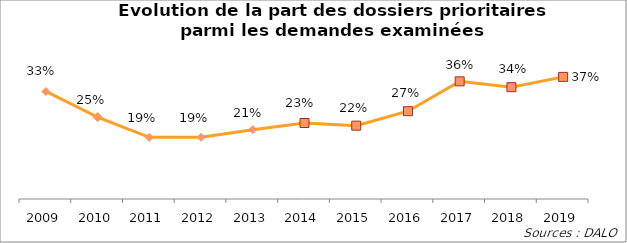
| Category | Series 1 |
|---|---|
| 2009.0 | 0.326 |
| 2010.0 | 0.248 |
| 2011.0 | 0.187 |
| 2012.0 | 0.187 |
| 2013.0 | 0.21 |
| 2014.0 | 0.23 |
| 2015.0 | 0.222 |
| 2016.0 | 0.266 |
| 2017.0 | 0.357 |
| 2018.0 | 0.339 |
| 2019.0 | 0.37 |